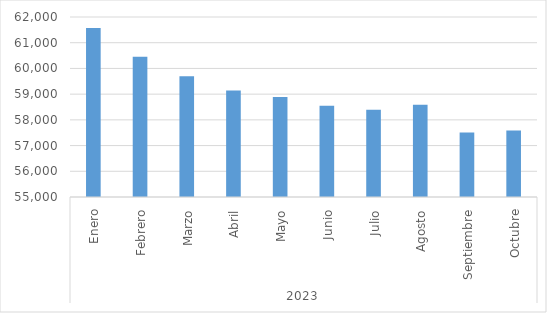
| Category | Total |
|---|---|
| 0 | 61571.849 |
| 1 | 60449.583 |
| 2 | 59697.186 |
| 3 | 59140.879 |
| 4 | 58886.914 |
| 5 | 58545.696 |
| 6 | 58390.263 |
| 7 | 58590.716 |
| 8 | 57504.211 |
| 9 | 57583.968 |